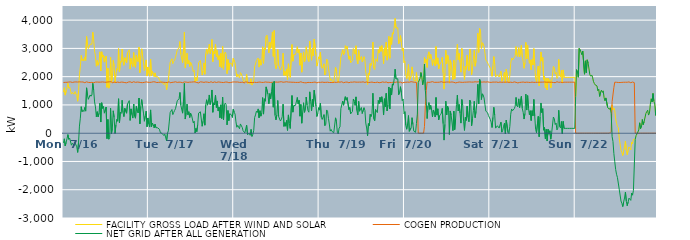
| Category | FACILITY GROSS LOAD AFTER WIND AND SOLAR | COGEN PRODUCTION | NET GRID AFTER ALL GENERATION |
|---|---|---|---|
|  Mon  7/16 | 1454 | 1795 | -341 |
|  Mon  7/16 | 1609 | 1807 | -198 |
|  Mon  7/16 | 1347 | 1799 | -452 |
|  Mon  7/16 | 1484 | 1810 | -326 |
|  Mon  7/16 | 1605 | 1801 | -196 |
|  Mon  7/16 | 1767 | 1816 | -49 |
|  Mon  7/16 | 1593 | 1810 | -217 |
|  Mon  7/16 | 1637 | 1813 | -176 |
|  Mon  7/16 | 1620 | 1814 | -194 |
|  Mon  7/16 | 1384 | 1809 | -425 |
|  Mon  7/16 | 1439 | 1796 | -357 |
|  Mon  7/16 | 1450 | 1793 | -343 |
|  Mon  7/16 | 1380 | 1810 | -430 |
|  Mon  7/16 | 1473 | 1811 | -338 |
|  Mon  7/16 | 1463 | 1814 | -351 |
|  Mon  7/16 | 1327 | 1809 | -482 |
|  Mon  7/16 | 1131 | 1810 | -679 |
|  Mon  7/16 | 1489 | 1809 | -320 |
|  Mon  7/16 | 2067 | 1816 | 251 |
|  Mon  7/16 | 2346 | 1815 | 531 |
|  Mon  7/16 | 2750 | 1812 | 938 |
|  Mon  7/16 | 2567 | 1807 | 760 |
|  Mon  7/16 | 2625 | 1812 | 813 |
|  Mon  7/16 | 2553 | 1786 | 767 |
|  Mon  7/16 | 2696 | 1787 | 909 |
|  Mon  7/16 | 2575 | 1794 | 781 |
|  Mon  7/16 | 3422 | 1817 | 1605 |
|  Mon  7/16 | 3162 | 1815 | 1347 |
|  Mon  7/16 | 2995 | 1797 | 1198 |
|  Mon  7/16 | 3015 | 1805 | 1210 |
|  Mon  7/16 | 3146 | 1793 | 1353 |
|  Mon  7/16 | 3123 | 1816 | 1307 |
|  Mon  7/16 | 3149 | 1799 | 1350 |
|  Mon  7/16 | 3572 | 1810 | 1762 |
|  Mon  7/16 | 3303 | 1785 | 1518 |
|  Mon  7/16 | 2903 | 1797 | 1106 |
|  Mon  7/16 | 2737 | 1807 | 930 |
|  Mon  7/16 | 2370 | 1788 | 582 |
|  Mon  7/16 | 2571 | 1809 | 762 |
|  Mon  7/16 | 2403 | 1826 | 577 |
|  Mon  7/16 | 2511 | 1805 | 706 |
|  Mon  7/16 | 2878 | 1816 | 1062 |
|  Mon  7/16 | 2202 | 1807 | 395 |
|  Mon  7/16 | 2880 | 1801 | 1079 |
|  Mon  7/16 | 2690 | 1814 | 876 |
|  Mon  7/16 | 2767 | 1818 | 949 |
|  Mon  7/16 | 2515 | 1806 | 709 |
|  Mon  7/16 | 2488 | 1804 | 684 |
|  Mon  7/16 | 2727 | 1803 | 924 |
|  Mon  7/16 | 1621 | 1814 | -193 |
|  Mon  7/16 | 2299 | 1812 | 487 |
|  Mon  7/16 | 1593 | 1807 | -214 |
|  Mon  7/16 | 1665 | 1819 | -154 |
|  Mon  7/16 | 2693 | 1810 | 883 |
|  Mon  7/16 | 1799 | 1821 | -22 |
|  Mon  7/16 | 1956 | 1782 | 174 |
|  Mon  7/16 | 2577 | 1784 | 793 |
|  Mon  7/16 | 2370 | 1810 | 560 |
|  Mon  7/16 | 1781 | 1792 | -11 |
|  Mon  7/16 | 2086 | 1794 | 292 |
|  Mon  7/16 | 2291 | 1796 | 495 |
|  Mon  7/16 | 2231 | 1809 | 422 |
|  Mon  7/16 | 2996 | 1778 | 1218 |
|  Mon  7/16 | 2165 | 1795 | 370 |
|  Mon  7/16 | 2547 | 1808 | 739 |
|  Mon  7/16 | 2510 | 1808 | 702 |
|  Mon  7/16 | 2975 | 1809 | 1166 |
|  Mon  7/16 | 2533 | 1805 | 728 |
|  Mon  7/16 | 2401 | 1814 | 587 |
|  Mon  7/16 | 2670 | 1790 | 880 |
|  Mon  7/16 | 2675 | 1809 | 866 |
|  Mon  7/16 | 2491 | 1784 | 707 |
|  Mon  7/16 | 2842 | 1811 | 1031 |
|  Mon  7/16 | 2831 | 1809 | 1022 |
|  Mon  7/16 | 2950 | 1798 | 1152 |
|  Mon  7/16 | 2270 | 1818 | 452 |
|  Mon  7/16 | 2649 | 1788 | 861 |
|  Mon  7/16 | 2447 | 1791 | 656 |
|  Mon  7/16 | 2353 | 1818 | 535 |
|  Mon  7/16 | 2854 | 1821 | 1033 |
|  Mon  7/16 | 2413 | 1814 | 599 |
|  Mon  7/16 | 2329 | 1799 | 530 |
|  Mon  7/16 | 2763 | 1814 | 949 |
|  Mon  7/16 | 2590 | 1809 | 781 |
|  Mon  7/16 | 2528 | 1812 | 716 |
|  Mon  7/16 | 3047 | 1804 | 1243 |
|  Mon  7/16 | 2145 | 1813 | 332 |
|  Mon  7/16 | 2743 | 1791 | 952 |
|  Mon  7/16 | 2985 | 1797 | 1188 |
|  Mon  7/16 | 2724 | 1788 | 936 |
|  Mon  7/16 | 2524 | 1813 | 711 |
|  Mon  7/16 | 2222 | 1799 | 423 |
|  Mon  7/16 | 2409 | 1801 | 608 |
|  Mon  7/16 | 2594 | 1815 | 779 |
|  Mon  7/16 | 2022 | 1794 | 228 |
|  Mon  7/16 | 2342 | 1803 | 539 |
|  Tue  7/17 | 2114 | 1789 | 325 |
|  Tue  7/17 | 2014 | 1797 | 217 |
|  Tue  7/17 | 2622 | 1798 | 824 |
|  Tue  7/17 | 2030 | 1803 | 227 |
|  Tue  7/17 | 2188 | 1829 | 359 |
|  Tue  7/17 | 2125 | 1819 | 306 |
|  Tue  7/17 | 2001 | 1814 | 187 |
|  Tue  7/17 | 2132 | 1814 | 318 |
|  Tue  7/17 | 1990 | 1795 | 195 |
|  Tue  7/17 | 2021 | 1792 | 229 |
|  Tue  7/17 | 1999 | 1809 | 190 |
|  Tue  7/17 | 1954 | 1799 | 155 |
|  Tue  7/17 | 1923 | 1786 | 137 |
|  Tue  7/17 | 1823 | 1804 | 19 |
|  Tue  7/17 | 1808 | 1806 | 2 |
|  Tue  7/17 | 1798 | 1807 | -9 |
|  Tue  7/17 | 1806 | 1805 | 1 |
|  Tue  7/17 | 1717 | 1801 | -84 |
|  Tue  7/17 | 1772 | 1808 | -36 |
|  Tue  7/17 | 1728 | 1795 | -67 |
|  Tue  7/17 | 1535 | 1810 | -275 |
|  Tue  7/17 | 1792 | 1794 | -2 |
|  Tue  7/17 | 1881 | 1798 | 83 |
|  Tue  7/17 | 2219 | 1821 | 398 |
|  Tue  7/17 | 2513 | 1783 | 730 |
|  Tue  7/17 | 2543 | 1789 | 754 |
|  Tue  7/17 | 2634 | 1797 | 837 |
|  Tue  7/17 | 2459 | 1801 | 658 |
|  Tue  7/17 | 2539 | 1805 | 734 |
|  Tue  7/17 | 2580 | 1776 | 804 |
|  Tue  7/17 | 2684 | 1818 | 866 |
|  Tue  7/17 | 2716 | 1820 | 896 |
|  Tue  7/17 | 2945 | 1798 | 1147 |
|  Tue  7/17 | 2972 | 1816 | 1156 |
|  Tue  7/17 | 3025 | 1806 | 1219 |
|  Tue  7/17 | 3242 | 1801 | 1441 |
|  Tue  7/17 | 2790 | 1802 | 988 |
|  Tue  7/17 | 2812 | 1808 | 1004 |
|  Tue  7/17 | 2496 | 1787 | 709 |
|  Tue  7/17 | 2938 | 1806 | 1132 |
|  Tue  7/17 | 3578 | 1813 | 1765 |
|  Tue  7/17 | 2312 | 1811 | 501 |
|  Tue  7/17 | 2538 | 1807 | 731 |
|  Tue  7/17 | 2828 | 1799 | 1029 |
|  Tue  7/17 | 2453 | 1798 | 655 |
|  Tue  7/17 | 2574 | 1815 | 759 |
|  Tue  7/17 | 2361 | 1806 | 555 |
|  Tue  7/17 | 2508 | 1798 | 710 |
|  Tue  7/17 | 2455 | 1808 | 647 |
|  Tue  7/17 | 2443 | 1789 | 654 |
|  Tue  7/17 | 2179 | 1815 | 364 |
|  Tue  7/17 | 2223 | 1799 | 424 |
|  Tue  7/17 | 1821 | 1815 | 6 |
|  Tue  7/17 | 1968 | 1799 | 169 |
|  Tue  7/17 | 1848 | 1792 | 56 |
|  Tue  7/17 | 2116 | 1809 | 307 |
|  Tue  7/17 | 2491 | 1780 | 711 |
|  Tue  7/17 | 2495 | 1806 | 689 |
|  Tue  7/17 | 2573 | 1816 | 757 |
|  Tue  7/17 | 2605 | 1815 | 790 |
|  Tue  7/17 | 2056 | 1810 | 246 |
|  Tue  7/17 | 2202 | 1778 | 424 |
|  Tue  7/17 | 2487 | 1798 | 689 |
|  Tue  7/17 | 2086 | 1802 | 284 |
|  Tue  7/17 | 2808 | 1812 | 996 |
|  Tue  7/17 | 2980 | 1797 | 1183 |
|  Tue  7/17 | 2797 | 1805 | 992 |
|  Tue  7/17 | 2946 | 1812 | 1134 |
|  Tue  7/17 | 3146 | 1793 | 1353 |
|  Tue  7/17 | 2813 | 1797 | 1016 |
|  Tue  7/17 | 2976 | 1820 | 1156 |
|  Tue  7/17 | 3315 | 1786 | 1529 |
|  Tue  7/17 | 2531 | 1791 | 740 |
|  Tue  7/17 | 2890 | 1816 | 1074 |
|  Tue  7/17 | 2811 | 1815 | 996 |
|  Tue  7/17 | 3143 | 1797 | 1346 |
|  Tue  7/17 | 2704 | 1794 | 910 |
|  Tue  7/17 | 2924 | 1783 | 1141 |
|  Tue  7/17 | 2602 | 1812 | 790 |
|  Tue  7/17 | 2743 | 1823 | 920 |
|  Tue  7/17 | 2353 | 1806 | 547 |
|  Tue  7/17 | 2822 | 1817 | 1005 |
|  Tue  7/17 | 2317 | 1798 | 519 |
|  Tue  7/17 | 3067 | 1794 | 1273 |
|  Tue  7/17 | 2261 | 1793 | 468 |
|  Tue  7/17 | 2802 | 1800 | 1002 |
|  Tue  7/17 | 2872 | 1808 | 1064 |
|  Tue  7/17 | 2783 | 1779 | 1004 |
|  Tue  7/17 | 2104 | 1809 | 295 |
|  Tue  7/17 | 2610 | 1808 | 802 |
|  Tue  7/17 | 2232 | 1788 | 444 |
|  Tue  7/17 | 2484 | 1795 | 689 |
|  Tue  7/17 | 2501 | 1792 | 709 |
|  Tue  7/17 | 2464 | 1817 | 647 |
|  Tue  7/17 | 2365 | 1809 | 556 |
|  Tue  7/17 | 2654 | 1808 | 846 |
|  Wed  7/18 | 2556 | 1813 | 743 |
|  Wed  7/18 | 2489 | 1813 | 676 |
|  Wed  7/18 | 2212 | 1810 | 402 |
|  Wed  7/18 | 1991 | 1780 | 211 |
|  Wed  7/18 | 2088 | 1811 | 277 |
|  Wed  7/18 | 2017 | 1801 | 216 |
|  Wed  7/18 | 1955 | 1798 | 157 |
|  Wed  7/18 | 2142 | 1814 | 328 |
|  Wed  7/18 | 2097 | 1799 | 298 |
|  Wed  7/18 | 2008 | 1800 | 208 |
|  Wed  7/18 | 1898 | 1810 | 88 |
|  Wed  7/18 | 1825 | 1772 | 53 |
|  Wed  7/18 | 1797 | 1786 | 11 |
|  Wed  7/18 | 1858 | 1816 | 42 |
|  Wed  7/18 | 2089 | 1804 | 285 |
|  Wed  7/18 | 1756 | 1802 | -46 |
|  Wed  7/18 | 1783 | 1800 | -17 |
|  Wed  7/18 | 1794 | 1794 | 0 |
|  Wed  7/18 | 1732 | 1807 | -75 |
|  Wed  7/18 | 1930 | 1794 | 136 |
|  Wed  7/18 | 1702 | 1817 | -115 |
|  Wed  7/18 | 1747 | 1791 | -44 |
|  Wed  7/18 | 1886 | 1783 | 103 |
|  Wed  7/18 | 2360 | 1804 | 556 |
|  Wed  7/18 | 2446 | 1799 | 647 |
|  Wed  7/18 | 2570 | 1793 | 777 |
|  Wed  7/18 | 2535 | 1802 | 733 |
|  Wed  7/18 | 2662 | 1803 | 859 |
|  Wed  7/18 | 2337 | 1791 | 546 |
|  Wed  7/18 | 2605 | 1809 | 796 |
|  Wed  7/18 | 2406 | 1804 | 602 |
|  Wed  7/18 | 2507 | 1797 | 710 |
|  Wed  7/18 | 3057 | 1797 | 1260 |
|  Wed  7/18 | 2472 | 1797 | 675 |
|  Wed  7/18 | 3016 | 1799 | 1217 |
|  Wed  7/18 | 2944 | 1812 | 1132 |
|  Wed  7/18 | 3423 | 1785 | 1638 |
|  Wed  7/18 | 3471 | 1804 | 1667 |
|  Wed  7/18 | 3193 | 1817 | 1376 |
|  Wed  7/18 | 2843 | 1803 | 1040 |
|  Wed  7/18 | 3219 | 1819 | 1400 |
|  Wed  7/18 | 3003 | 1794 | 1209 |
|  Wed  7/18 | 3260 | 1794 | 1466 |
|  Wed  7/18 | 3582 | 1803 | 1779 |
|  Wed  7/18 | 2717 | 1797 | 920 |
|  Wed  7/18 | 3631 | 1801 | 1830 |
|  Wed  7/18 | 2437 | 1809 | 628 |
|  Wed  7/18 | 2281 | 1810 | 471 |
|  Wed  7/18 | 2432 | 1785 | 647 |
|  Wed  7/18 | 2962 | 1805 | 1157 |
|  Wed  7/18 | 2409 | 1820 | 589 |
|  Wed  7/18 | 2409 | 1812 | 597 |
|  Wed  7/18 | 2233 | 1799 | 434 |
|  Wed  7/18 | 2300 | 1821 | 479 |
|  Wed  7/18 | 2381 | 1798 | 583 |
|  Wed  7/18 | 2828 | 1803 | 1025 |
|  Wed  7/18 | 2046 | 1805 | 241 |
|  Wed  7/18 | 2186 | 1810 | 376 |
|  Wed  7/18 | 2044 | 1796 | 248 |
|  Wed  7/18 | 2273 | 1820 | 453 |
|  Wed  7/18 | 1892 | 1793 | 99 |
|  Wed  7/18 | 2455 | 1808 | 647 |
|  Wed  7/18 | 2152 | 1801 | 351 |
|  Wed  7/18 | 1975 | 1808 | 167 |
|  Wed  7/18 | 1947 | 1786 | 161 |
|  Wed  7/18 | 3134 | 1803 | 1331 |
|  Wed  7/18 | 2546 | 1802 | 744 |
|  Wed  7/18 | 2777 | 1802 | 975 |
|  Wed  7/18 | 2762 | 1811 | 951 |
|  Wed  7/18 | 2783 | 1796 | 987 |
|  Wed  7/18 | 2802 | 1808 | 994 |
|  Wed  7/18 | 3060 | 1797 | 1263 |
|  Wed  7/18 | 2841 | 1802 | 1039 |
|  Wed  7/18 | 2960 | 1798 | 1162 |
|  Wed  7/18 | 2404 | 1802 | 602 |
|  Wed  7/18 | 2836 | 1819 | 1017 |
|  Wed  7/18 | 2159 | 1805 | 354 |
|  Wed  7/18 | 2532 | 1794 | 738 |
|  Wed  7/18 | 2875 | 1799 | 1076 |
|  Wed  7/18 | 2522 | 1786 | 736 |
|  Wed  7/18 | 2607 | 1803 | 804 |
|  Wed  7/18 | 3059 | 1782 | 1277 |
|  Wed  7/18 | 2806 | 1813 | 993 |
|  Wed  7/18 | 2596 | 1798 | 798 |
|  Wed  7/18 | 2535 | 1793 | 742 |
|  Wed  7/18 | 3257 | 1794 | 1463 |
|  Wed  7/18 | 2922 | 1795 | 1127 |
|  Wed  7/18 | 2581 | 1792 | 789 |
|  Wed  7/18 | 3005 | 1810 | 1195 |
|  Wed  7/18 | 2739 | 1800 | 939 |
|  Wed  7/18 | 3328 | 1809 | 1519 |
|  Wed  7/18 | 3325 | 1809 | 1516 |
|  Wed  7/18 | 2780 | 1820 | 960 |
|  Wed  7/18 | 2372 | 1781 | 591 |
|  Wed  7/18 | 2493 | 1792 | 701 |
|  Wed  7/18 | 2704 | 1801 | 903 |
|  Thu  7/19 | 2627 | 1810 | 817 |
|  Thu  7/19 | 2865 | 1798 | 1067 |
|  Thu  7/19 | 2360 | 1799 | 561 |
|  Thu  7/19 | 2295 | 1808 | 487 |
|  Thu  7/19 | 2276 | 1804 | 472 |
|  Thu  7/19 | 2454 | 1797 | 657 |
|  Thu  7/19 | 2059 | 1792 | 267 |
|  Thu  7/19 | 2114 | 1799 | 315 |
|  Thu  7/19 | 2624 | 1802 | 822 |
|  Thu  7/19 | 2583 | 1804 | 779 |
|  Thu  7/19 | 2310 | 1782 | 528 |
|  Thu  7/19 | 2118 | 1794 | 324 |
|  Thu  7/19 | 1864 | 1792 | 72 |
|  Thu  7/19 | 1926 | 1794 | 132 |
|  Thu  7/19 | 1844 | 1783 | 61 |
|  Thu  7/19 | 1859 | 1793 | 66 |
|  Thu  7/19 | 1812 | 1792 | 20 |
|  Thu  7/19 | 1818 | 1805 | 13 |
|  Thu  7/19 | 2331 | 1788 | 543 |
|  Thu  7/19 | 2202 | 1796 | 406 |
|  Thu  7/19 | 1828 | 1794 | 34 |
|  Thu  7/19 | 1787 | 1813 | -26 |
|  Thu  7/19 | 1996 | 1813 | 183 |
|  Thu  7/19 | 2027 | 1805 | 222 |
|  Thu  7/19 | 2680 | 1811 | 869 |
|  Thu  7/19 | 2686 | 1818 | 868 |
|  Thu  7/19 | 2954 | 1819 | 1135 |
|  Thu  7/19 | 2775 | 1786 | 989 |
|  Thu  7/19 | 2816 | 1802 | 1014 |
|  Thu  7/19 | 3095 | 1804 | 1291 |
|  Thu  7/19 | 2982 | 1816 | 1166 |
|  Thu  7/19 | 3074 | 1809 | 1265 |
|  Thu  7/19 | 3098 | 1807 | 1291 |
|  Thu  7/19 | 2619 | 1785 | 834 |
|  Thu  7/19 | 2732 | 1819 | 913 |
|  Thu  7/19 | 2493 | 1806 | 687 |
|  Thu  7/19 | 2504 | 1791 | 713 |
|  Thu  7/19 | 2573 | 1804 | 769 |
|  Thu  7/19 | 2998 | 1788 | 1210 |
|  Thu  7/19 | 2950 | 1815 | 1135 |
|  Thu  7/19 | 2795 | 1812 | 983 |
|  Thu  7/19 | 3091 | 1806 | 1285 |
|  Thu  7/19 | 2603 | 1802 | 801 |
|  Thu  7/19 | 2449 | 1805 | 644 |
|  Thu  7/19 | 2925 | 1801 | 1124 |
|  Thu  7/19 | 2584 | 1807 | 777 |
|  Thu  7/19 | 2579 | 1802 | 777 |
|  Thu  7/19 | 2715 | 1806 | 909 |
|  Thu  7/19 | 2518 | 1821 | 697 |
|  Thu  7/19 | 2485 | 1816 | 669 |
|  Thu  7/19 | 2706 | 1804 | 902 |
|  Thu  7/19 | 2607 | 1797 | 810 |
|  Thu  7/19 | 2162 | 1803 | 359 |
|  Thu  7/19 | 1997 | 1813 | 184 |
|  Thu  7/19 | 1723 | 1814 | -91 |
|  Thu  7/19 | 2131 | 1792 | 339 |
|  Thu  7/19 | 2061 | 1792 | 269 |
|  Thu  7/19 | 2465 | 1800 | 665 |
|  Thu  7/19 | 2398 | 1807 | 591 |
|  Thu  7/19 | 2506 | 1809 | 697 |
|  Thu  7/19 | 3223 | 1810 | 1413 |
|  Thu  7/19 | 2306 | 1793 | 513 |
|  Thu  7/19 | 2247 | 1809 | 438 |
|  Thu  7/19 | 2634 | 1793 | 841 |
|  Thu  7/19 | 2619 | 1802 | 817 |
|  Thu  7/19 | 2535 | 1806 | 729 |
|  Thu  7/19 | 2955 | 1797 | 1158 |
|  Thu  7/19 | 2833 | 1786 | 1047 |
|  Thu  7/19 | 3062 | 1792 | 1270 |
|  Thu  7/19 | 2894 | 1795 | 1099 |
|  Thu  7/19 | 3100 | 1810 | 1290 |
|  Thu  7/19 | 2891 | 1814 | 1077 |
|  Thu  7/19 | 2455 | 1812 | 643 |
|  Thu  7/19 | 3019 | 1799 | 1220 |
|  Thu  7/19 | 2749 | 1814 | 935 |
|  Thu  7/19 | 3223 | 1812 | 1411 |
|  Thu  7/19 | 2583 | 1795 | 788 |
|  Thu  7/19 | 2793 | 1784 | 1009 |
|  Thu  7/19 | 3426 | 1791 | 1635 |
|  Thu  7/19 | 2651 | 1795 | 856 |
|  Thu  7/19 | 3384 | 1792 | 1592 |
|  Thu  7/19 | 3143 | 1793 | 1350 |
|  Thu  7/19 | 3554 | 1809 | 1745 |
|  Thu  7/19 | 3505 | 1807 | 1698 |
|  Thu  7/19 | 3756 | 1817 | 1939 |
|  Thu  7/19 | 4060 | 1797 | 2263 |
|  Thu  7/19 | 3719 | 1800 | 1919 |
|  Thu  7/19 | 3745 | 1812 | 1933 |
|  Thu  7/19 | 3728 | 1802 | 1926 |
|  Thu  7/19 | 3163 | 1802 | 1361 |
|  Thu  7/19 | 3249 | 1801 | 1448 |
|  Thu  7/19 | 3453 | 1808 | 1645 |
|  Thu  7/19 | 3212 | 1783 | 1429 |
|  Thu  7/19 | 2923 | 1775 | 1148 |
|  Thu  7/19 | 3013 | 1802 | 1211 |
|  Thu  7/19 | 2493 | 1798 | 695 |
|  Fri  7/20 | 2554 | 1795 | 759 |
|  Fri  7/20 | 2083 | 1803 | 280 |
|  Fri  7/20 | 1930 | 1790 | 140 |
|  Fri  7/20 | 2132 | 1807 | 325 |
|  Fri  7/20 | 2431 | 1807 | 624 |
|  Fri  7/20 | 1870 | 1804 | 66 |
|  Fri  7/20 | 1888 | 1808 | 80 |
|  Fri  7/20 | 2019 | 1822 | 197 |
|  Fri  7/20 | 2346 | 1798 | 548 |
|  Fri  7/20 | 2117 | 1811 | 306 |
|  Fri  7/20 | 1865 | 1792 | 73 |
|  Fri  7/20 | 1843 | 1801 | 42 |
|  Fri  7/20 | 1839 | 1808 | 31 |
|  Fri  7/20 | 2146 | 1799 | 347 |
|  Fri  7/20 | 1854 | 1178 | 676 |
|  Fri  7/20 | 1791 | 0 | 1791 |
|  Fri  7/20 | 1780 | 0 | 1780 |
|  Fri  7/20 | 1936 | 0 | 1936 |
|  Fri  7/20 | 2145 | 0 | 2145 |
|  Fri  7/20 | 1997 | 0 | 1997 |
|  Fri  7/20 | 1714 | 0 | 1714 |
|  Fri  7/20 | 1893 | 0 | 1893 |
|  Fri  7/20 | 2681 | 233 | 2448 |
|  Fri  7/20 | 2500 | 985 | 1515 |
|  Fri  7/20 | 2615 | 1507 | 1108 |
|  Fri  7/20 | 2328 | 1809 | 519 |
|  Fri  7/20 | 2763 | 1802 | 961 |
|  Fri  7/20 | 2880 | 1797 | 1083 |
|  Fri  7/20 | 2640 | 1797 | 843 |
|  Fri  7/20 | 2788 | 1808 | 980 |
|  Fri  7/20 | 2618 | 1812 | 806 |
|  Fri  7/20 | 2401 | 1823 | 578 |
|  Fri  7/20 | 2615 | 1794 | 821 |
|  Fri  7/20 | 2551 | 1799 | 752 |
|  Fri  7/20 | 2382 | 1808 | 574 |
|  Fri  7/20 | 3064 | 1801 | 1263 |
|  Fri  7/20 | 2441 | 1801 | 640 |
|  Fri  7/20 | 2665 | 1801 | 864 |
|  Fri  7/20 | 2281 | 1810 | 471 |
|  Fri  7/20 | 2423 | 1805 | 618 |
|  Fri  7/20 | 2453 | 1797 | 656 |
|  Fri  7/20 | 2531 | 1821 | 710 |
|  Fri  7/20 | 2684 | 1806 | 878 |
|  Fri  7/20 | 2136 | 1800 | 336 |
|  Fri  7/20 | 1560 | 1804 | -244 |
|  Fri  7/20 | 2118 | 1803 | 315 |
|  Fri  7/20 | 2934 | 1801 | 1133 |
|  Fri  7/20 | 2456 | 1810 | 646 |
|  Fri  7/20 | 2765 | 1806 | 959 |
|  Fri  7/20 | 2719 | 1810 | 909 |
|  Fri  7/20 | 1767 | 1813 | -46 |
|  Fri  7/20 | 2592 | 1805 | 787 |
|  Fri  7/20 | 2459 | 1819 | 640 |
|  Fri  7/20 | 2440 | 1813 | 627 |
|  Fri  7/20 | 1884 | 1794 | 90 |
|  Fri  7/20 | 2580 | 1800 | 780 |
|  Fri  7/20 | 1929 | 1803 | 126 |
|  Fri  7/20 | 2281 | 1780 | 501 |
|  Fri  7/20 | 2822 | 1806 | 1016 |
|  Fri  7/20 | 3141 | 1795 | 1346 |
|  Fri  7/20 | 2596 | 1810 | 786 |
|  Fri  7/20 | 2826 | 1810 | 1016 |
|  Fri  7/20 | 2517 | 1808 | 709 |
|  Fri  7/20 | 2160 | 1803 | 357 |
|  Fri  7/20 | 2995 | 1804 | 1191 |
|  Fri  7/20 | 2778 | 1798 | 980 |
|  Fri  7/20 | 2217 | 1792 | 425 |
|  Fri  7/20 | 1904 | 1805 | 99 |
|  Fri  7/20 | 2375 | 1813 | 562 |
|  Fri  7/20 | 2259 | 1806 | 453 |
|  Fri  7/20 | 2760 | 1804 | 956 |
|  Fri  7/20 | 2371 | 1810 | 561 |
|  Fri  7/20 | 2209 | 1804 | 405 |
|  Fri  7/20 | 2979 | 1813 | 1166 |
|  Fri  7/20 | 2875 | 1793 | 1082 |
|  Fri  7/20 | 2070 | 1807 | 263 |
|  Fri  7/20 | 2322 | 1800 | 522 |
|  Fri  7/20 | 2608 | 1809 | 799 |
|  Fri  7/20 | 2930 | 1801 | 1129 |
|  Fri  7/20 | 2368 | 1818 | 550 |
|  Fri  7/20 | 2563 | 1791 | 772 |
|  Fri  7/20 | 2911 | 1812 | 1099 |
|  Fri  7/20 | 3536 | 1807 | 1729 |
|  Fri  7/20 | 2859 | 1821 | 1038 |
|  Fri  7/20 | 3706 | 1798 | 1908 |
|  Fri  7/20 | 3626 | 1811 | 1815 |
|  Fri  7/20 | 2998 | 1809 | 1189 |
|  Fri  7/20 | 3202 | 1807 | 1395 |
|  Fri  7/20 | 3166 | 1814 | 1352 |
|  Fri  7/20 | 3063 | 1815 | 1248 |
|  Fri  7/20 | 2836 | 1823 | 1013 |
|  Fri  7/20 | 2587 | 1808 | 779 |
|  Fri  7/20 | 2548 | 1796 | 752 |
|  Fri  7/20 | 2542 | 1817 | 725 |
|  Fri  7/20 | 2425 | 1803 | 622 |
|  Fri  7/20 | 2407 | 1802 | 605 |
|  Sat  7/21 | 2303 | 1816 | 487 |
|  Sat  7/21 | 2189 | 1797 | 392 |
|  Sat  7/21 | 2011 | 1809 | 202 |
|  Sat  7/21 | 2370 | 1809 | 561 |
|  Sat  7/21 | 2711 | 1796 | 915 |
|  Sat  7/21 | 2443 | 1806 | 637 |
|  Sat  7/21 | 1989 | 1810 | 179 |
|  Sat  7/21 | 1981 | 1810 | 171 |
|  Sat  7/21 | 2070 | 1806 | 264 |
|  Sat  7/21 | 2079 | 1796 | 283 |
|  Sat  7/21 | 1989 | 1808 | 181 |
|  Sat  7/21 | 2107 | 1810 | 297 |
|  Sat  7/21 | 2190 | 1801 | 389 |
|  Sat  7/21 | 1837 | 1801 | 36 |
|  Sat  7/21 | 1910 | 1809 | 101 |
|  Sat  7/21 | 2053 | 1805 | 248 |
|  Sat  7/21 | 2159 | 1802 | 357 |
|  Sat  7/21 | 1781 | 1805 | -24 |
|  Sat  7/21 | 2264 | 1800 | 464 |
|  Sat  7/21 | 2272 | 1809 | 463 |
|  Sat  7/21 | 1823 | 1798 | 25 |
|  Sat  7/21 | 1785 | 1798 | -13 |
|  Sat  7/21 | 2050 | 1807 | 243 |
|  Sat  7/21 | 2478 | 1805 | 673 |
|  Sat  7/21 | 2663 | 1806 | 857 |
|  Sat  7/21 | 2588 | 1794 | 794 |
|  Sat  7/21 | 2607 | 1802 | 805 |
|  Sat  7/21 | 2682 | 1815 | 867 |
|  Sat  7/21 | 2738 | 1787 | 951 |
|  Sat  7/21 | 3065 | 1800 | 1265 |
|  Sat  7/21 | 2758 | 1794 | 964 |
|  Sat  7/21 | 2707 | 1779 | 928 |
|  Sat  7/21 | 3028 | 1813 | 1215 |
|  Sat  7/21 | 2700 | 1796 | 904 |
|  Sat  7/21 | 2691 | 1807 | 884 |
|  Sat  7/21 | 3105 | 1803 | 1302 |
|  Sat  7/21 | 2683 | 1811 | 872 |
|  Sat  7/21 | 2548 | 1810 | 738 |
|  Sat  7/21 | 2297 | 1796 | 501 |
|  Sat  7/21 | 2493 | 1797 | 696 |
|  Sat  7/21 | 3212 | 1831 | 1381 |
|  Sat  7/21 | 2625 | 1806 | 819 |
|  Sat  7/21 | 3110 | 1780 | 1330 |
|  Sat  7/21 | 2682 | 1800 | 882 |
|  Sat  7/21 | 2472 | 1820 | 652 |
|  Sat  7/21 | 2590 | 1795 | 795 |
|  Sat  7/21 | 2247 | 1799 | 448 |
|  Sat  7/21 | 2606 | 1808 | 798 |
|  Sat  7/21 | 2413 | 1795 | 618 |
|  Sat  7/21 | 2991 | 1798 | 1193 |
|  Sat  7/21 | 2422 | 1813 | 609 |
|  Sat  7/21 | 1938 | 1800 | 138 |
|  Sat  7/21 | 1819 | 1802 | 17 |
|  Sat  7/21 | 1819 | 1801 | 18 |
|  Sat  7/21 | 2377 | 1781 | 596 |
|  Sat  7/21 | 1679 | 1804 | -125 |
|  Sat  7/21 | 2396 | 1819 | 577 |
|  Sat  7/21 | 2875 | 1806 | 1069 |
|  Sat  7/21 | 2550 | 1822 | 728 |
|  Sat  7/21 | 2675 | 1807 | 868 |
|  Sat  7/21 | 1903 | 1796 | 107 |
|  Sat  7/21 | 2012 | 1812 | 200 |
|  Sat  7/21 | 1600 | 1798 | -198 |
|  Sat  7/21 | 1943 | 1804 | 139 |
|  Sat  7/21 | 1532 | 1809 | -277 |
|  Sat  7/21 | 1944 | 1805 | 139 |
|  Sat  7/21 | 1777 | 1811 | -34 |
|  Sat  7/21 | 1890 | 1804 | 86 |
|  Sat  7/21 | 1600 | 1811 | -211 |
|  Sat  7/21 | 1807 | 1803 | 4 |
|  Sat  7/21 | 1789 | 1782 | 7 |
|  Sat  7/21 | 2365 | 1794 | 571 |
|  Sat  7/21 | 2310 | 1795 | 515 |
|  Sat  7/21 | 2094 | 1788 | 306 |
|  Sat  7/21 | 2151 | 1790 | 361 |
|  Sat  7/21 | 1935 | 1820 | 115 |
|  Sat  7/21 | 2006 | 1826 | 180 |
|  Sat  7/21 | 2610 | 1800 | 810 |
|  Sat  7/21 | 2040 | 1806 | 234 |
|  Sat  7/21 | 1994 | 1806 | 188 |
|  Sat  7/21 | 2230 | 1816 | 414 |
|  Sat  7/21 | 1773 | 1792 | -19 |
|  Sat  7/21 | 2239 | 1821 | 418 |
|  Sat  7/21 | 1976 | 1805 | 171 |
|  Sat  7/21 | 1976 | 1805 | 171 |
|  Sat  7/21 | 1976 | 1805 | 171 |
|  Sat  7/21 | 1976 | 1805 | 171 |
|  Sat  7/21 | 1976 | 1805 | 171 |
|  Sat  7/21 | 1976 | 1805 | 171 |
|  Sat  7/21 | 1976 | 1805 | 171 |
|  Sat  7/21 | 1976 | 1805 | 171 |
|  Sat  7/21 | 1976 | 1805 | 171 |
|  Sat  7/21 | 1976 | 1805 | 171 |
|  Sat  7/21 | 1976 | 1805 | 171 |
|  Sat  7/21 | 1976 | 1805 | 171 |
|  Sat  7/21 | 1976 | 1805 | 171 |
|  Sun  7/22 | 1299 | 0 | 1299 |
|  Sun  7/22 | 2248 | 0 | 2248 |
|  Sun  7/22 | 2163 | 0 | 2163 |
|  Sun  7/22 | 1981 | 0 | 1981 |
|  Sun  7/22 | 2999 | 0 | 2999 |
|  Sun  7/22 | 2962 | 0 | 2962 |
|  Sun  7/22 | 2942 | 0 | 2942 |
|  Sun  7/22 | 2775 | 0 | 2775 |
|  Sun  7/22 | 2906 | 0 | 2906 |
|  Sun  7/22 | 2898 | 0 | 2898 |
|  Sun  7/22 | 2088 | 0 | 2088 |
|  Sun  7/22 | 2560 | 0 | 2560 |
|  Sun  7/22 | 2140 | 0 | 2140 |
|  Sun  7/22 | 2596 | 0 | 2596 |
|  Sun  7/22 | 2486 | 0 | 2486 |
|  Sun  7/22 | 2481 | 0 | 2481 |
|  Sun  7/22 | 2066 | 0 | 2066 |
|  Sun  7/22 | 2017 | 0 | 2017 |
|  Sun  7/22 | 2060 | 0 | 2060 |
|  Sun  7/22 | 1984 | 0 | 1984 |
|  Sun  7/22 | 1836 | 0 | 1836 |
|  Sun  7/22 | 1761 | 0 | 1761 |
|  Sun  7/22 | 1710 | 0 | 1710 |
|  Sun  7/22 | 1704 | 0 | 1704 |
|  Sun  7/22 | 1673 | 0 | 1673 |
|  Sun  7/22 | 1499 | 0 | 1499 |
|  Sun  7/22 | 1556 | 0 | 1556 |
|  Sun  7/22 | 1301 | 0 | 1301 |
|  Sun  7/22 | 1451 | 0 | 1451 |
|  Sun  7/22 | 1522 | 0 | 1522 |
|  Sun  7/22 | 1442 | 0 | 1442 |
|  Sun  7/22 | 1499 | 0 | 1499 |
|  Sun  7/22 | 1261 | 0 | 1261 |
|  Sun  7/22 | 1144 | 0 | 1144 |
|  Sun  7/22 | 1249 | 0 | 1249 |
|  Sun  7/22 | 1270 | 0 | 1270 |
|  Sun  7/22 | 912 | 0 | 912 |
|  Sun  7/22 | 910 | 0 | 910 |
|  Sun  7/22 | 845 | 0 | 845 |
|  Sun  7/22 | 901 | 0 | 901 |
|  Sun  7/22 | 753 | 63 | 690 |
|  Sun  7/22 | 1001 | 1117 | -116 |
|  Sun  7/22 | 823 | 1118 | -295 |
|  Sun  7/22 | 896 | 1614 | -718 |
|  Sun  7/22 | 796 | 1805 | -1009 |
|  Sun  7/22 | 510 | 1791 | -1281 |
|  Sun  7/22 | 349 | 1801 | -1452 |
|  Sun  7/22 | 243 | 1809 | -1566 |
|  Sun  7/22 | 198 | 1794 | -1596 |
|  Sun  7/22 | -177 | 1801 | -1978 |
|  Sun  7/22 | -178 | 1793 | -1971 |
|  Sun  7/22 | -601 | 1796 | -2397 |
|  Sun  7/22 | -684 | 1798 | -2482 |
|  Sun  7/22 | -789 | 1807 | -2596 |
|  Sun  7/22 | -627 | 1802 | -2429 |
|  Sun  7/22 | -484 | 1809 | -2293 |
|  Sun  7/22 | -279 | 1803 | -2082 |
|  Sun  7/22 | -601 | 1809 | -2410 |
|  Sun  7/22 | -762 | 1803 | -2565 |
|  Sun  7/22 | -611 | 1826 | -2437 |
|  Sun  7/22 | -484 | 1814 | -2298 |
|  Sun  7/22 | -531 | 1803 | -2334 |
|  Sun  7/22 | -590 | 1786 | -2376 |
|  Sun  7/22 | -310 | 1808 | -2118 |
|  Sun  7/22 | -382 | 1810 | -2192 |
|  Sun  7/22 | -217 | 1804 | -2021 |
|  Sun  7/22 | -214 | 1788 | -2002 |
|  Sun  7/22 | -214 | 0 | -214 |
|  Sun  7/22 | -82 | 0 | -82 |
|  Sun  7/22 | -25 | 0 | -25 |
|  Sun  7/22 | 41 | 0 | 41 |
|  Sun  7/22 | 117 | 0 | 117 |
|  Sun  7/22 | 368 | 0 | 368 |
|  Sun  7/22 | 157 | 0 | 157 |
|  Sun  7/22 | 220 | 0 | 220 |
|  Sun  7/22 | 484 | 0 | 484 |
|  Sun  7/22 | 303 | 0 | 303 |
|  Sun  7/22 | 407 | 0 | 407 |
|  Sun  7/22 | 406 | 0 | 406 |
|  Sun  7/22 | 698 | 0 | 698 |
|  Sun  7/22 | 763 | 0 | 763 |
|  Sun  7/22 | 813 | 0 | 813 |
|  Sun  7/22 | 641 | 0 | 641 |
|  Sun  7/22 | 711 | 0 | 711 |
|  Sun  7/22 | 1020 | 0 | 1020 |
|  Sun  7/22 | 1216 | 0 | 1216 |
|  Sun  7/22 | 1109 | 0 | 1109 |
|  Sun  7/22 | 1405 | 0 | 1405 |
|  Sun  7/22 | 1131 | 0 | 1131 |
|  Sun  7/22 | 1034 | 0 | 1034 |
|  Sun  7/22 | 631 | 0 | 631 |
|  Sun  7/22 | 1002 | 0 | 1002 |